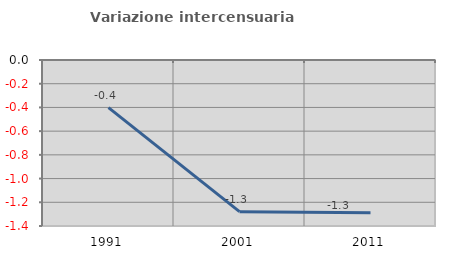
| Category | Variazione intercensuaria annua |
|---|---|
| 1991.0 | -0.402 |
| 2001.0 | -1.279 |
| 2011.0 | -1.288 |